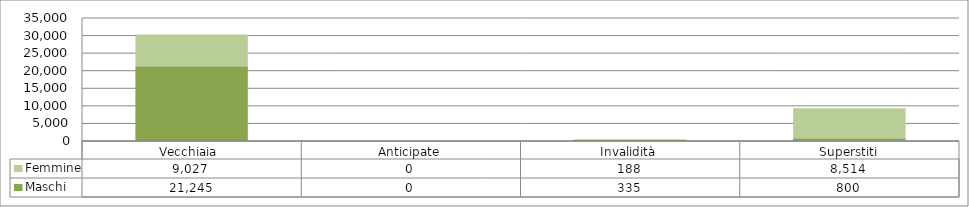
| Category | Maschi | Femmine |
|---|---|---|
| Vecchiaia  | 21245 | 9027 |
| Anticipate | 0 | 0 |
| Invalidità | 335 | 188 |
| Superstiti | 800 | 8514 |